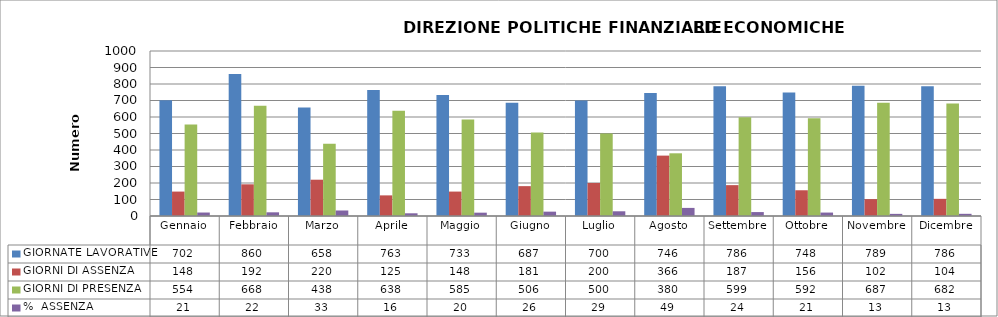
| Category | GIORNATE LAVORATIVE | GIORNI DI ASSENZA | GIORNI DI PRESENZA | %  ASSENZA |
|---|---|---|---|---|
| Gennaio | 702 | 148 | 554 | 21.083 |
| Febbraio | 860 | 192 | 668 | 22.326 |
| Marzo | 658 | 220 | 438 | 33.435 |
| Aprile | 763 | 125 | 638 | 16.383 |
| Maggio | 733 | 148 | 585 | 20.191 |
| Giugno | 687 | 181 | 506 | 26.346 |
| Luglio | 700 | 200 | 500 | 28.571 |
| Agosto | 746 | 366 | 380 | 49.062 |
| Settembre | 786 | 187 | 599 | 23.791 |
| Ottobre | 748 | 156 | 592 | 20.856 |
| Novembre | 789 | 102 | 687 | 12.928 |
| Dicembre | 786 | 104 | 682 | 13.232 |